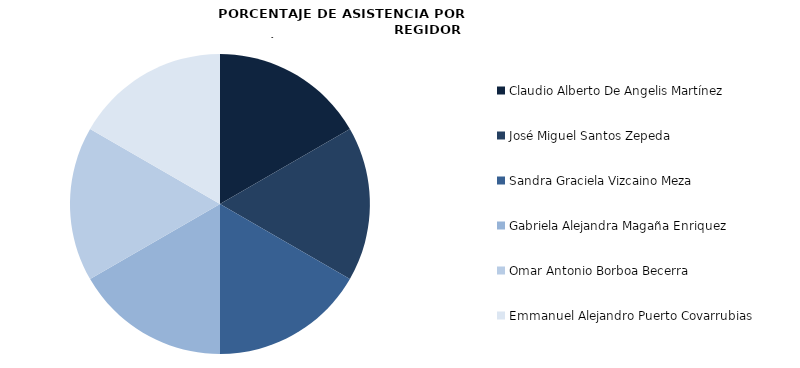
| Category | Series 0 |
|---|---|
| Claudio Alberto De Angelis Martínez | 100 |
| José Miguel Santos Zepeda | 100 |
| Sandra Graciela Vizcaino Meza | 100 |
| Gabriela Alejandra Magaña Enriquez | 100 |
| Omar Antonio Borboa Becerra | 100 |
| Emmanuel Alejandro Puerto Covarrubias | 100 |